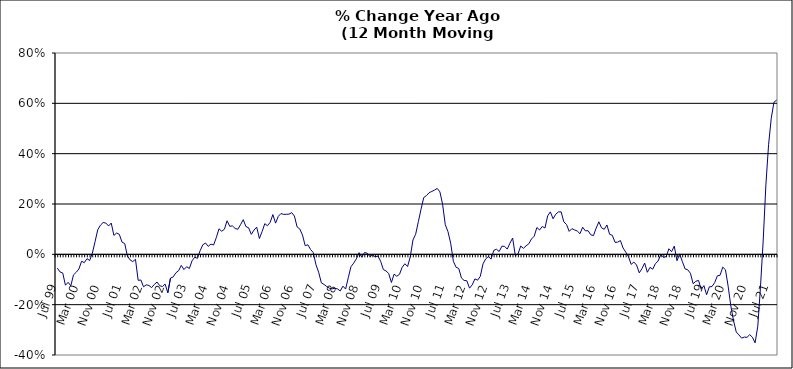
| Category | Series 0 |
|---|---|
| Jul 99 | -0.055 |
| Aug 99 | -0.07 |
| Sep 99 | -0.074 |
| Oct 99 | -0.123 |
| Nov 99 | -0.111 |
| Dec 99 | -0.125 |
| Jan 00 | -0.082 |
| Feb 00 | -0.071 |
| Mar 00 | -0.058 |
| Apr 00 | -0.027 |
| May 00 | -0.033 |
| Jun 00 | -0.017 |
| Jul 00 | -0.025 |
| Aug 00 | 0.005 |
| Sep 00 | 0.05 |
| Oct 00 | 0.098 |
| Nov 00 | 0.116 |
| Dec 00 | 0.127 |
| Jan 01 | 0.124 |
| Feb 01 | 0.113 |
| Mar 01 | 0.124 |
| Apr 01 | 0.075 |
| May 01 | 0.085 |
| Jun 01 | 0.08 |
| Jul 01 | 0.048 |
| Aug 01 | 0.043 |
| Sep 01 | -0.007 |
| Oct 01 | -0.022 |
| Nov 01 | -0.029 |
| Dec 01 | -0.02 |
| Jan 02 | -0.103 |
| Feb 02 | -0.102 |
| Mar 02 | -0.129 |
| Apr 02 | -0.121 |
| May 02 | -0.124 |
| Jun 02 | -0.132 |
| Jul 02 | -0.119 |
| Aug 02 | -0.11 |
| Sep 02 | -0.125 |
| Oct 02 | -0.128 |
| Nov 02 | -0.118 |
| Dec 02 | -0.153 |
| Jan 03 | -0.094 |
| Feb 03 | -0.09 |
| Mar 03 | -0.073 |
| Apr 03 | -0.065 |
| May 03 | -0.044 |
| Jun 03 | -0.06 |
| Jul 03 | -0.049 |
| Aug 03 | -0.056 |
| Sep 03 | -0.026 |
| Oct 03 | -0.012 |
| Nov 03 | -0.016 |
| Dec 03 | 0.014 |
| Jan 04 | 0.038 |
| Feb 04 | 0.045 |
| Mar 04 | 0.032 |
| Apr 04 | 0.041 |
| May 04 | 0.037 |
| Jun 04 | 0.066 |
| Jul 04 | 0.101 |
| Aug 04 | 0.092 |
| Sep 04 | 0.1 |
| Oct 04 | 0.133 |
| Nov 04 | 0.111 |
| Dec 04 | 0.113 |
| Jan 05 | 0.103 |
| Feb 05 | 0.1 |
| Mar 05 | 0.118 |
| Apr 05 | 0.138 |
| May 05 | 0.11 |
| Jun 05 | 0.106 |
| Jul 05 | 0.079 |
| Aug 05 | 0.097 |
| Sep 05 | 0.108 |
| Oct 05 | 0.063 |
| Nov 05 | 0.09 |
| Dec 05 | 0.122 |
| Jan 06 | 0.114 |
| Feb 06 | 0.127 |
| Mar 06 | 0.158 |
| Apr 06 | 0.124 |
| May 06 | 0.151 |
| Jun 06 | 0.162 |
| Jul 06 | 0.159 |
| Aug 06 | 0.159 |
| Sep 06 | 0.16 |
| Oct 06 | 0.166 |
| Nov 06 | 0.152 |
| Dec 06 | 0.109 |
| Jan 07 | 0.101 |
| Feb 07 | 0.076 |
| Mar 07 | 0.034 |
| Apr 07 | 0.038 |
| May 07 | 0.019 |
| Jun 07 | 0.007 |
| Jul 07 | -0.041 |
| Aug 07 | -0.071 |
| Sep 07 | -0.113 |
| Oct 07 | -0.12 |
| Nov 07 | -0.128 |
| Dec 07 | -0.135 |
| Jan 08 | -0.137 |
| Feb 08 | -0.135 |
| Mar 08 | -0.137 |
| Apr 08 | -0.145 |
| May 08 | -0.126 |
| Jun 08 | -0.138 |
| Jul 08 | -0.093 |
| Aug 08 | -0.049 |
| Sep-08 | -0.035 |
| Oct 08 | -0.018 |
| Nov 08 | 0.007 |
| Dec 08 | -0.011 |
| Jan 09 | 0.007 |
| Feb 09 | 0.005 |
| Mar 09 | -0.009 |
| Apr 09 | -0.003 |
| May 09 | -0.01 |
| Jun 09 | -0.007 |
| Jul 09 | -0.027 |
| Aug 09 | -0.06 |
| Sep 09 | -0.066 |
| Oct 09 | -0.076 |
| Nov 09 | -0.112 |
| Dec 09 | -0.079 |
| Jan 10 | -0.087 |
| Feb 10 | -0.079 |
| Mar 10 | -0.052 |
| Apr 10 | -0.037 |
| May 10 | -0.048 |
| Jun 10 | -0.01 |
| Jul 10 | 0.057 |
| Aug 10 | 0.08 |
| Sep 10 | 0.13 |
| Oct 10 | 0.179 |
| Nov 10 | 0.226 |
| Dec 10 | 0.233 |
| Jan 11 | 0.245 |
| Feb 11 | 0.25 |
| Mar 11 | 0.255 |
| Apr 11 | 0.262 |
| May 11 | 0.248 |
| Jun 11 | 0.199 |
| Jul 11 | 0.118 |
| Aug 11 | 0.09 |
| Sep 11 | 0.044 |
| Oct 11 | -0.028 |
| Nov 11 | -0.051 |
| Dec 11 | -0.056 |
| Jan 12 | -0.094 |
| Feb 12 | -0.104 |
| Mar 12 | -0.105 |
| Apr 12 | -0.134 |
| May 12 | -0.121 |
| Jun 12 | -0.098 |
| Jul 12 | -0.103 |
| Aug 12 | -0.087 |
| Sep 12 | -0.038 |
| Oct 12 | -0.018 |
| Nov 12 | -0.009 |
| Dec 12 | -0.019 |
| Jan 13 | 0.016 |
| Feb-13 | 0.02 |
| Mar-13 | 0.011 |
| Apr 13 | 0.032 |
| May 13 | 0.032 |
| Jun-13 | 0.021 |
| Jul 13 | 0.045 |
| Aug 13 | 0.065 |
| Sep 13 | -0.005 |
| Oct 13 | 0.002 |
| Nov 13 | 0.033 |
| Dec 13 | 0.024 |
| Jan 14 | 0.034 |
| Feb-14 | 0.042 |
| Mar 14 | 0.061 |
| Apr 14 | 0.072 |
| May 14 | 0.107 |
| Jun 14 | 0.097 |
| Jul-14 | 0.111 |
| Aug-14 | 0.105 |
| Sep 14 | 0.153 |
| Oct 14 | 0.169 |
| Nov 14 | 0.141 |
| Dec 14 | 0.159 |
| Jan 15 | 0.169 |
| Feb 15 | 0.169 |
| Mar 15 | 0.129 |
| Apr-15 | 0.118 |
| May 15 | 0.091 |
| Jun-15 | 0.102 |
| Jul 15 | 0.097 |
| Aug 15 | 0.092 |
| Sep 15 | 0.082 |
| Oct 15 | 0.108 |
| Nov 15 | 0.093 |
| Dec 15 | 0.094 |
| Jan 16 | 0.078 |
| Feb 16 | 0.075 |
| Mar 16 | 0.104 |
| Apr 16 | 0.129 |
| May 16 | 0.105 |
| Jun 16 | 0.1 |
| Jul 16 | 0.117 |
| Aug 16 | 0.08 |
| Sep 16 | 0.076 |
| Oct 16 | 0.048 |
| Nov 16 | 0.048 |
| Dec 16 | 0.055 |
| Jan 17 | 0.025 |
| Feb 17 | 0.009 |
| Mar 17 | -0.01 |
| Apr 17 | -0.04 |
| May 17 | -0.031 |
| Jun 17 | -0.042 |
| Jul 17 | -0.074 |
| Aug 17 | -0.057 |
| Sep 17 | -0.035 |
| Oct 17 | -0.071 |
| Nov 17 | -0.052 |
| Dec 17 | -0.059 |
| Jan 18 | -0.037 |
| Feb 18 | -0.027 |
| Mar 18 | 0 |
| Apr 18 | -0.012 |
| May 18 | -0.009 |
| Jun 18 | 0.022 |
| Jul 18 | 0.01 |
| Aug 18 | 0.033 |
| Sep 18 | -0.025 |
| Oct 18 | 0.002 |
| Nov 18 | -0.029 |
| Dec 18 | -0.058 |
| Jan 19 | -0.061 |
| Feb 19 | -0.075 |
| Mar 19 | -0.117 |
| Apr 19 | -0.107 |
| May 19 | -0.104 |
| Jun 19 | -0.139 |
| Jul 19 | -0.124 |
| Aug 19 | -0.16 |
| Sep 19 | -0.129 |
| Oct 19 | -0.128 |
| Nov 19 | -0.112 |
| Dec 19 | -0.085 |
| Jan 20 | -0.083 |
| Feb 20 | -0.051 |
| Mar 20 | -0.061 |
| Apr 20 | -0.127 |
| May 20 | -0.206 |
| Jun 20 | -0.264 |
| Jul 20 | -0.308 |
| Aug 20 | -0.32 |
| Sep 20 | -0.333 |
| Oct 20 | -0.329 |
| Nov 20 | -0.33 |
| Dec 20 | -0.319 |
| Jan 21 | -0.329 |
| Feb 21 | -0.352 |
| Mar 21 | -0.286 |
| Apr 21 | -0.129 |
| May 21 | 0.053 |
| Jun 21 | 0.276 |
| Jul 21 | 0.435 |
| Aug 21 | 0.541 |
| Sep 21 | 0.604 |
| Oct 21 | 0.613 |